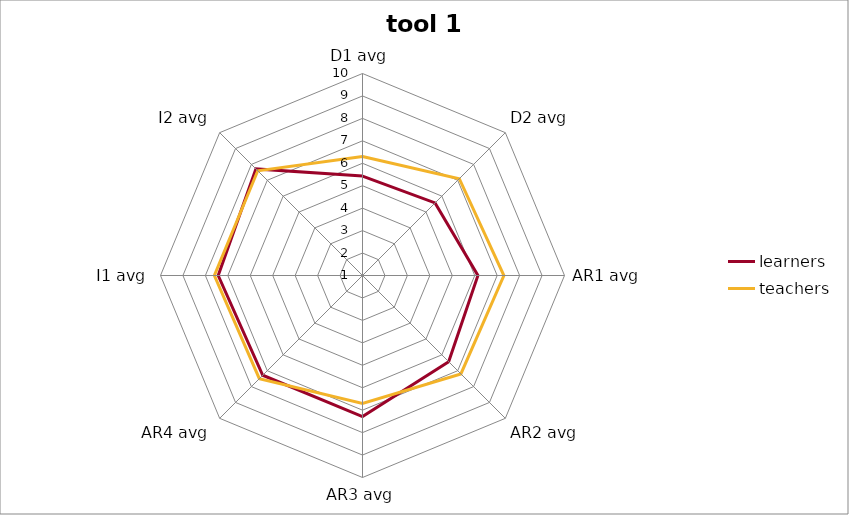
| Category | learners | teachers |
|---|---|---|
| D1 avg | 5.429 | 6.3 |
| D2 avg | 5.571 | 7.1 |
| AR1 avg | 6.143 | 7.3 |
| AR2 avg | 6.429 | 7.2 |
| AR3 avg | 7.286 | 6.7 |
| AR4 avg | 7.286 | 7.5 |
| I1 avg | 7.429 | 7.6 |
| I2 avg | 7.714 | 7.6 |